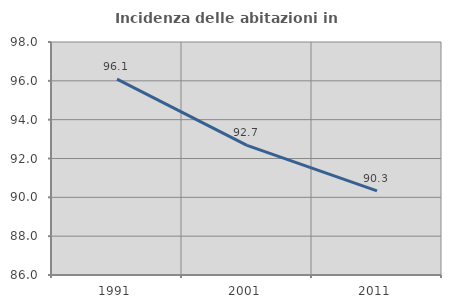
| Category | Incidenza delle abitazioni in proprietà  |
|---|---|
| 1991.0 | 96.084 |
| 2001.0 | 92.676 |
| 2011.0 | 90.331 |